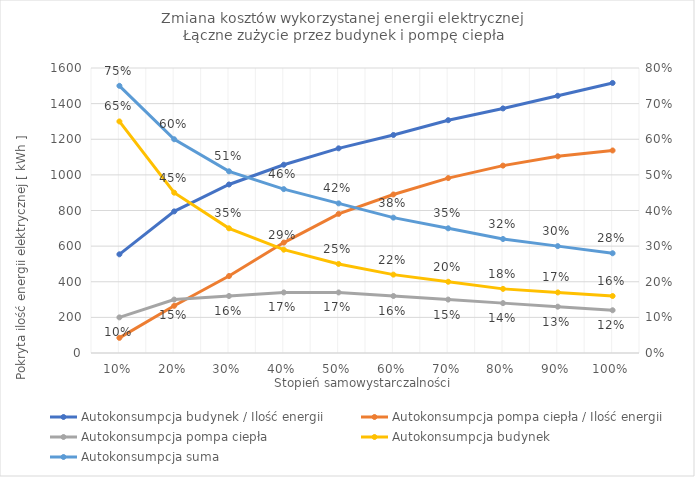
| Category | Autokonsumpcja budynek / Ilość energii | Autokonsumpcja pompa ciepła / Ilość energii |
|---|---|---|
| 0.1 | 554 | 85 |
| 0.2 | 795 | 265 |
| 0.3 | 946 | 432 |
| 0.4 | 1057 | 620 |
| 0.5 | 1149 | 781 |
| 0.6 | 1224 | 890 |
| 0.7 | 1307 | 982 |
| 0.8 | 1373 | 1052 |
| 0.9 | 1444 | 1104 |
| 1.0 | 1516 | 1137 |